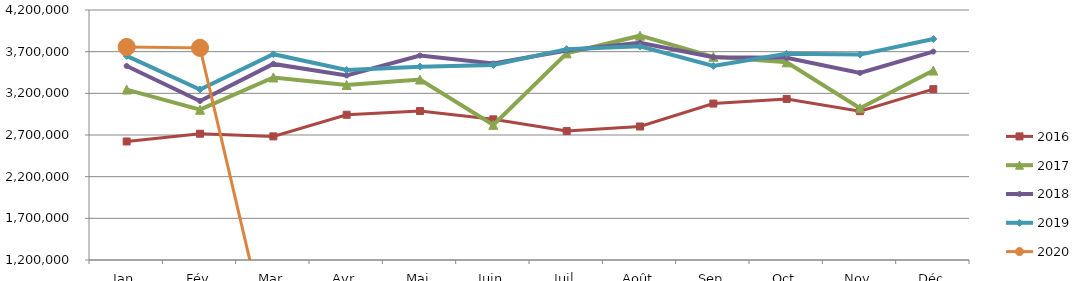
| Category | 2015 | 2016 | 2017 | 2018 | 2019 | 2020 |
|---|---|---|---|---|---|---|
| Jan |  | 2622357.223 | 3245197.198 | 3528241.229 | 3649683.28 | 3756283.089 |
| Fév |  | 2715310.977 | 3003729.629 | 3108555.552 | 3245578.859 | 3745626.569 |
| Mar |  | 2683334.081 | 3390554.233 | 3553184.371 | 3669368.201 | 0 |
| Avr |  | 2942696.513 | 3299613.683 | 3414889.226 | 3480737.518 | 0 |
| Mai |  | 2987632.117 | 3365963.719 | 3653293.789 | 3520173.393 | 0 |
| Juin |  | 2887718.315 | 2821580.781 | 3557351.211 | 3540194.304 | 0 |
| Juil |  | 2747166.698 | 3679918.411 | 3714873.235 | 3730287.221 | 0 |
| Août |  | 2802126.518 | 3891741.582 | 3805404.89 | 3764065.715 | 0 |
| Sep |  | 3077154.853 | 3637785.062 | 3633589.924 | 3528193.213 | 0 |
| Oct |  | 3132986.26 | 3572314.256 | 3626810.501 | 3674095.651 | 0 |
| Nov |  | 2985784.845 | 3021243.296 | 3445044.438 | 3664597.161 | 0 |
| Déc |  | 3249878.984 | 3473156.754 | 3701418.855 | 3851208.606 | 0 |